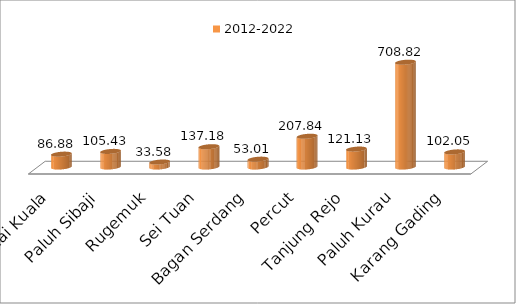
| Category | 2012-2022 |
|---|---|
| Denai Kuala | 86.88 |
| Paluh Sibaji | 105.43 |
| Rugemuk | 33.58 |
| Sei Tuan | 137.18 |
| Bagan Serdang | 53.01 |
| Percut | 207.84 |
| Tanjung Rejo | 121.13 |
| Paluh Kurau | 708.82 |
| Karang Gading | 102.05 |